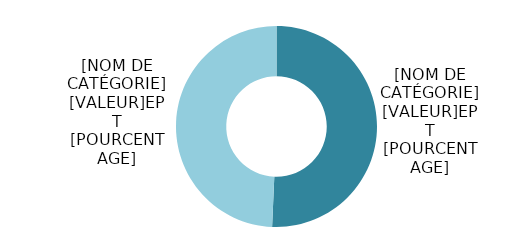
| Category | Series 0 |
|---|---|
| Hommes | 2408.264 |
| Femmes | 2341.97 |